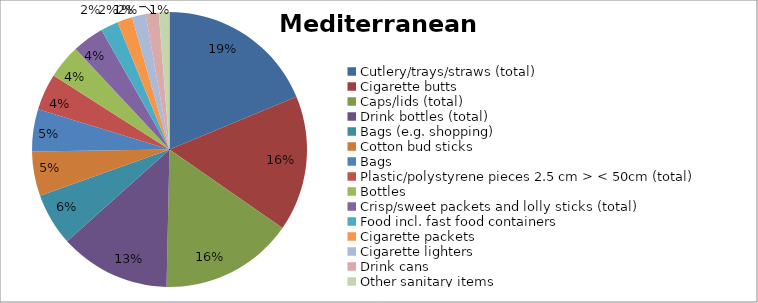
| Category | Series 0 |
|---|---|
| Cutlery/trays/straws (total) | 0.167 |
| Cigarette butts | 0.142 |
| Caps/lids (total) | 0.14 |
| Drink bottles (total) | 0.116 |
| Bags (e.g. shopping) | 0.055 |
| Cotton bud sticks | 0.047 |
| Bags | 0.044 |
| Plastic/polystyrene pieces 2.5 cm > < 50cm (total) | 0.038 |
| Bottles | 0.036 |
| Crisp/sweet packets and lolly sticks (total) | 0.033 |
| Food incl. fast food containers | 0.019 |
| Cigarette packets | 0.016 |
| Cigarette lighters | 0.014 |
| Drink cans | 0.014 |
| Other sanitary items | 0.011 |